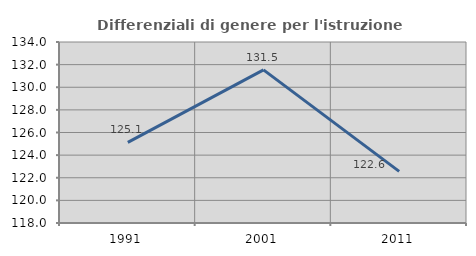
| Category | Differenziali di genere per l'istruzione superiore |
|---|---|
| 1991.0 | 125.125 |
| 2001.0 | 131.538 |
| 2011.0 | 122.566 |